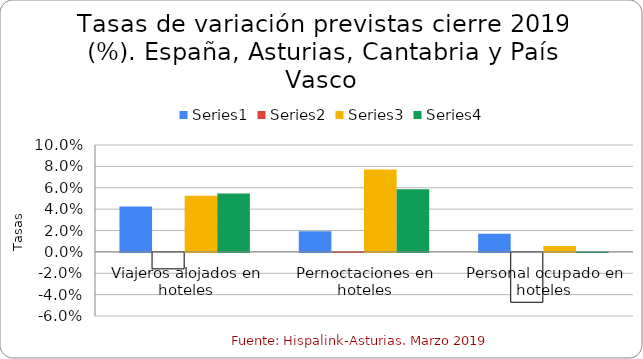
| Category | Series 0 | Series 1 | Series 2 | Series 3 |
|---|---|---|---|---|
| Viajeros alojados en hoteles | 0.042 | -0.015 | 0.052 | 0.055 |
| Pernoctaciones en hoteles | 0.019 | 0 | 0.077 | 0.059 |
| Personal ocupado en hoteles | 0.017 | -0.047 | 0.006 | 0 |